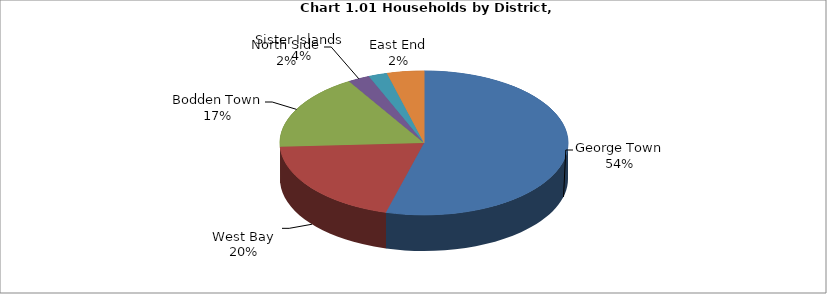
| Category | Series 0 |
|---|---|
| George Town | 13109 |
| West Bay | 4806 |
| Bodden Town | 4147 |
| North Side | 594 |
| East End | 508 |
| Sister Islands  | 1001 |